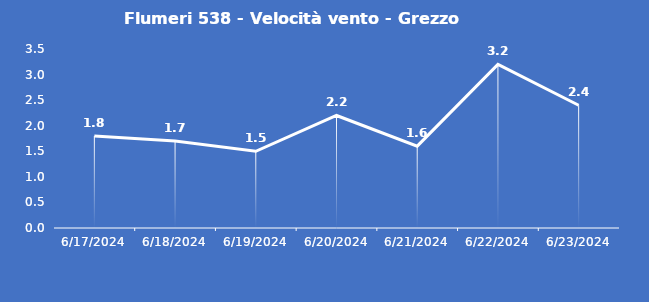
| Category | Flumeri 538 - Velocità vento - Grezzo (m/s) |
|---|---|
| 6/17/24 | 1.8 |
| 6/18/24 | 1.7 |
| 6/19/24 | 1.5 |
| 6/20/24 | 2.2 |
| 6/21/24 | 1.6 |
| 6/22/24 | 3.2 |
| 6/23/24 | 2.4 |